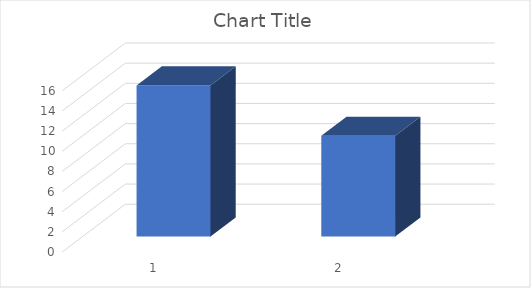
| Category | Series 0 |
|---|---|
| 0 | 15 |
| 1900-01-01 | 10 |